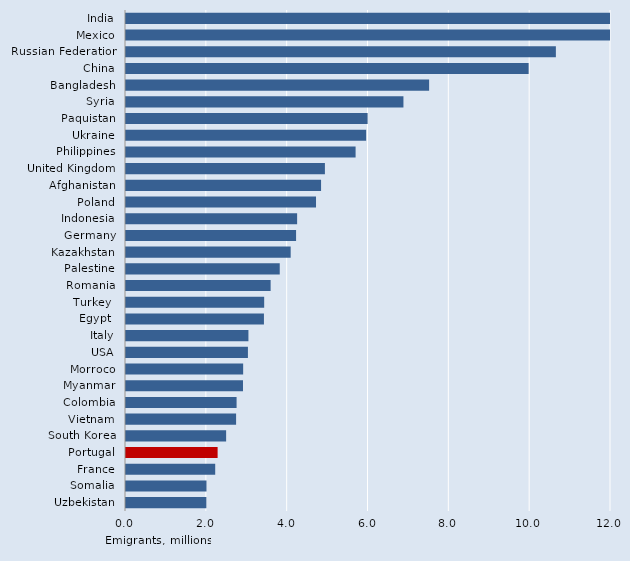
| Category | Series 0 |
|---|---|
| India | 16.588 |
| Mexico | 12.965 |
| Russian Federation | 10.636 |
| China | 9.962 |
| Bangladesh | 7.5 |
| Syria | 6.864 |
| Paquistan | 5.979 |
| Ukraine | 5.942 |
| Philippines | 5.681 |
| United Kingdom | 4.921 |
| Afghanistan | 4.826 |
| Poland | 4.701 |
| Indonesia | 4.234 |
| Germany | 4.208 |
| Kazakhstan | 4.074 |
| Palestine | 3.804 |
| Romania | 3.579 |
| Turkey  | 3.419 |
| Egypt  | 3.413 |
| Italy | 3.029 |
| USA | 3.017 |
| Morroco | 2.899 |
| Myanmar | 2.895 |
| Colombia | 2.736 |
| Vietnam | 2.724 |
| South Korea | 2.478 |
| Portugal | 2.267 |
| France | 2.207 |
| Somalia | 1.992 |
| Uzbekistan | 1.988 |